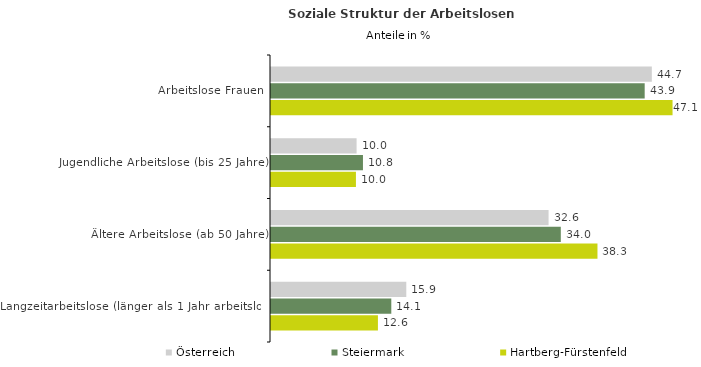
| Category | Österreich | Steiermark | Hartberg-Fürstenfeld |
|---|---|---|---|
| Arbeitslose Frauen | 44.699 | 43.86 | 47.13 |
| Jugendliche Arbeitslose (bis 25 Jahre) | 10.046 | 10.794 | 9.969 |
| Ältere Arbeitslose (ab 50 Jahre) | 32.578 | 34.015 | 38.318 |
| Langzeitarbeitslose (länger als 1 Jahr arbeitslos) | 15.879 | 14.12 | 12.55 |